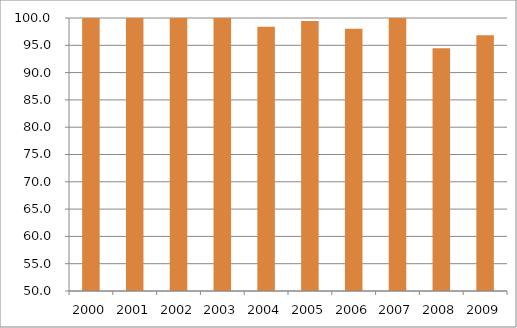
| Category | Região Sul |
|---|---|
| 2000.0 | 101.25 |
| 2001.0 | 102.7 |
| 2002.0 | 100.66 |
| 2003.0 | 100.36 |
| 2004.0 | 98.38 |
| 2005.0 | 99.45 |
| 2006.0 | 98.01 |
| 2007.0 | 101.84 |
| 2008.0 | 94.46 |
| 2009.0 | 96.83 |